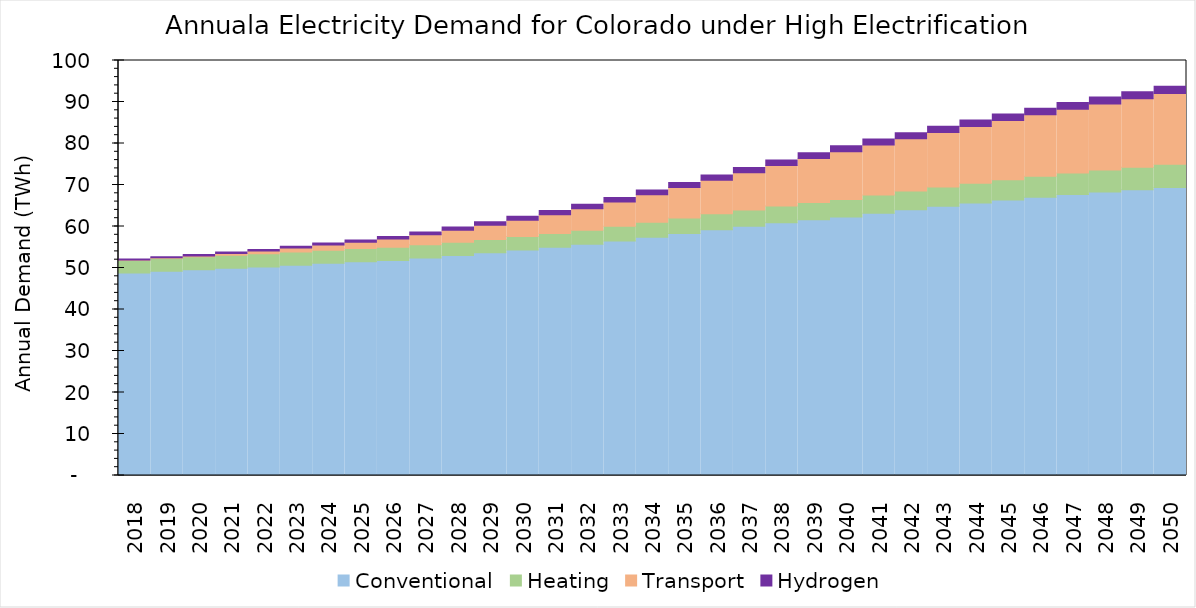
| Category | Conventional | Heating | Transport | Hydrogen |
|---|---|---|---|---|
| 2018.0 | 48789231.085 | 3095275.256 | 16843.623 | 276213.391 |
| 2019.0 | 49230745.571 | 3107193.178 | 107780.604 | 286683.242 |
| 2020.0 | 49605735.81 | 3114599.213 | 200338.93 | 302819.805 |
| 2021.0 | 49938728.696 | 3126049.473 | 453877.399 | 324362.164 |
| 2022.0 | 50270533.418 | 3137212.307 | 713086.289 | 353993.612 |
| 2023.0 | 50689815.867 | 3153601.697 | 979739.467 | 391187.016 |
| 2024.0 | 51124586.447 | 3170698.841 | 1253513.769 | 446197.55 |
| 2025.0 | 51491490.537 | 3183337.891 | 1532266.034 | 517146.106 |
| 2026.0 | 51836410.661 | 3185233.374 | 1969960.061 | 589879.281 |
| 2027.0 | 52392346.053 | 3199472.396 | 2429377.026 | 676540.701 |
| 2028.0 | 52995686.554 | 3215870.662 | 2907177.064 | 768596.888 |
| 2029.0 | 53654804.037 | 3234861.377 | 3405465.4 | 851693.927 |
| 2030.0 | 54346177.269 | 3254952.143 | 3924383.681 | 928675.576 |
| 2031.0 | 54985140.74 | 3335568.943 | 4535532.979 | 996479.955 |
| 2032.0 | 55695652.2 | 3422410.664 | 5177728.775 | 1054969.663 |
| 2033.0 | 56525438.52 | 3518674.78 | 5858940.134 | 1112855.182 |
| 2034.0 | 57427291.382 | 3621736.633 | 6578463.703 | 1164153.968 |
| 2035.0 | 58336122.239 | 3727685.91 | 7331439.707 | 1214848.154 |
| 2036.0 | 59212436.406 | 3834058.235 | 8113696.346 | 1259061.447 |
| 2037.0 | 60057397.01 | 3940923.833 | 8925325.113 | 1301411.61 |
| 2038.0 | 60880681.523 | 4048923.055 | 9767835.192 | 1338798.858 |
| 2039.0 | 61611673.735 | 4153318.461 | 10629349.117 | 1380981.364 |
| 2040.0 | 62273110.94 | 4255491.791 | 11511774.769 | 1407710.926 |
| 2041.0 | 63184305.612 | 4388464.865 | 12047464.993 | 1439350.269 |
| 2042.0 | 64036789.088 | 4520130.878 | 12586351.865 | 1470402.161 |
| 2043.0 | 64868837.765 | 4653081.503 | 13135386.57 | 1501761.972 |
| 2044.0 | 65644340.991 | 4784660.197 | 13686912.628 | 1532532.617 |
| 2045.0 | 66366172.859 | 4914927.971 | 14240758.112 | 1563259.708 |
| 2046.0 | 67076505.998 | 5046912.854 | 14805477.995 | 1594954.81 |
| 2047.0 | 67711813.117 | 5175761.969 | 15366670.978 | 1626710.826 |
| 2048.0 | 68301203.734 | 5303507.99 | 15929943.902 | 1658778.372 |
| 2049.0 | 68871883.558 | 5432170.769 | 16501160.803 | 1692372.332 |
| 2050.0 | 69418852.728 | 5561321.986 | 17078947.344 | 1726549.851 |